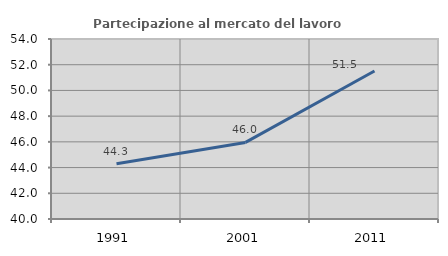
| Category | Partecipazione al mercato del lavoro  femminile |
|---|---|
| 1991.0 | 44.3 |
| 2001.0 | 45.957 |
| 2011.0 | 51.507 |